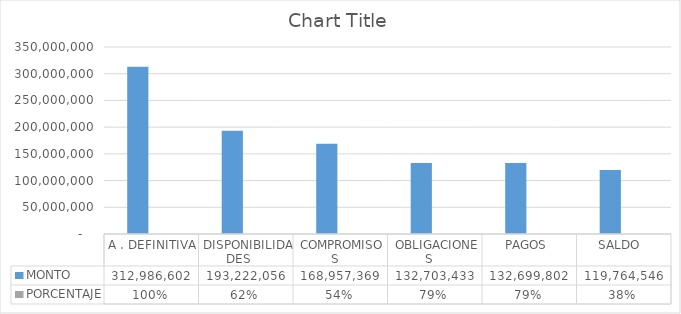
| Category | MONTO | PORCENTAJE |
|---|---|---|
| A . DEFINITIVA | 312986601.593 | 1 |
| DISPONIBILIDADES    | 193222055.873 | 0.617 |
| COMPROMISOS   | 168957369.258 | 0.54 |
| OBLIGACIONES   | 132703432.971 | 0.785 |
| PAGOS  | 132699801.971 | 0.785 |
| SALDO   | 119764545.72 | 0.38 |